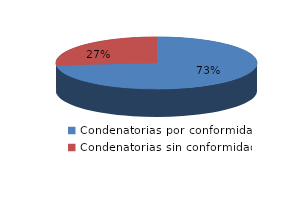
| Category | Series 0 |
|---|---|
| 0 | 545 |
| 1 | 197 |